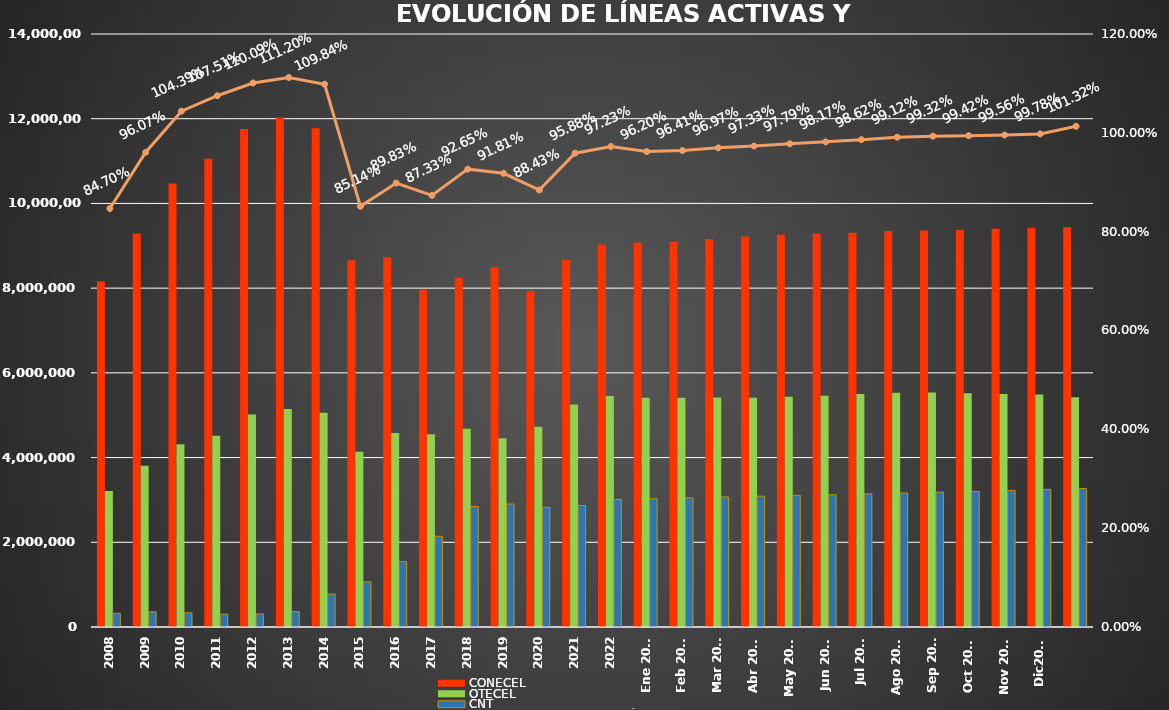
| Category | CONECEL | OTECEL | CNT |
|---|---|---|---|
| 2008 | 8156359 | 3211922 | 323967 |
| 2009 | 9291268 | 3806432 | 356900 |
| 2010 | 10470502 | 4314599 | 333730 |
| 2011 | 11057316 | 4513874 | 303368 |
| 2012 | 11757906 | 5019686 | 309271 |
| 2013 | 12030886 | 5148308 | 362560 |
| 2014 | 11772020 | 5055645 | 776892 |
| 2015 | 8658619 | 4134698 | 1065703 |
| 2016 | 8726823 | 4580092 | 1541219 |
| 2017 | 7960263 | 4549024 | 2142117 |
| 2018 | 8248050 | 4679646 | 2845142 |
| 2019 | 8493054 | 4456356 | 2903690 |
| 2020 | 7929253 | 4729725 | 2826388 |
| 2021 | 8665715 | 5254468 | 2869417 |
| 2022 | 9027737 | 5451115 | 3011899 |
| Ene 2023 | 9073421 | 5411860 | 3028254 |
| Feb 2023 | 9092490 | 5410682 | 3048837 |
| Mar 2023 | 9162562 | 5419670 | 3070611 |
| Abr 2023 | 9220042 | 5409581 | 3089410 |
| May 2023 | 9259499 | 5434175 | 3108405 |
| Jun 2023 | 9290231 | 5458655 | 3123905 |
| Jul 2023 | 9310350 | 5499232 | 3144067 |
| Ago 2023 | 9349530 | 5530451 | 3164614 |
| Sep 2023 | 9361007 | 5536629 | 3184663 |
| Oct 2023 | 9378363 | 5518632 | 3202774 |
| Nov 2023 | 9399776 | 5500199 | 3225513 |
| Dic2023 | 9425714 | 5489576 | 3250322 |